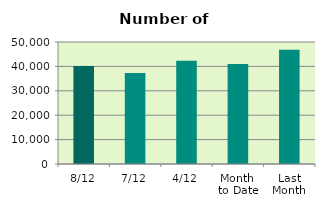
| Category | Series 0 |
|---|---|
| 8/12 | 40158 |
| 7/12 | 37260 |
| 4/12 | 42266 |
| Month 
to Date | 41032.333 |
| Last
Month | 46860.952 |